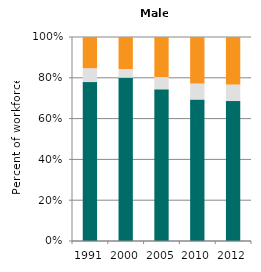
| Category | Agriculture | Industry | Services |
|---|---|---|---|
| 1991.0 | 77.89 | 6.808 | 15.302 |
| 2000.0 | 80.06 | 4.243 | 15.698 |
| 2005.0 | 74.361 | 5.998 | 19.642 |
| 2010.0 | 69.358 | 7.829 | 22.813 |
| 2012.0 | 68.598 | 8.096 | 23.306 |